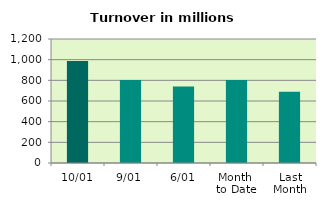
| Category | Series 0 |
|---|---|
| 10/01 | 987.684 |
| 9/01 | 802.535 |
| 6/01 | 739.408 |
| Month 
to Date | 802.375 |
| Last
Month | 689.27 |